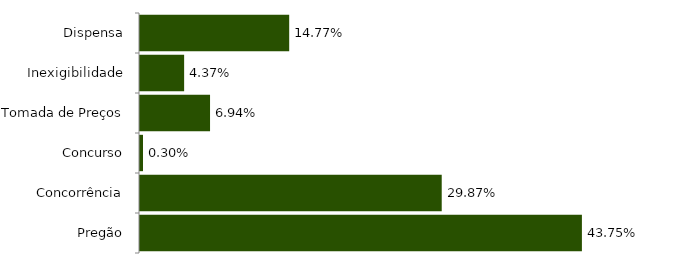
| Category | Series 0 |
|---|---|
| Pregão | 0.438 |
| Concorrência | 0.299 |
| Concurso | 0.003 |
| Tomada de Preços | 0.069 |
| Inexigibilidade | 0.044 |
| Dispensa | 0.148 |